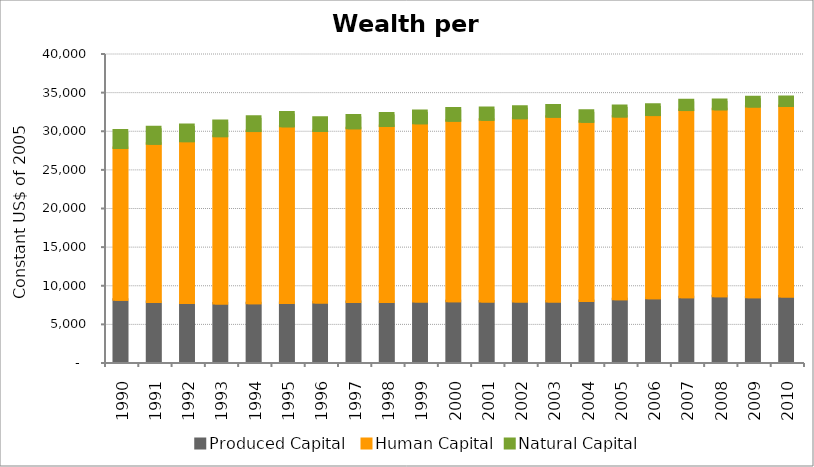
| Category | Produced Capital  | Human Capital | Natural Capital |
|---|---|---|---|
| 1990.0 | 8049.137 | 19653.275 | 2276.206 |
| 1991.0 | 7763.539 | 20486.15 | 2137.865 |
| 1992.0 | 7622.068 | 20968.73 | 2074.773 |
| 1993.0 | 7588.926 | 21650.348 | 1944.096 |
| 1994.0 | 7596.095 | 22299.273 | 1838.948 |
| 1995.0 | 7622.296 | 22881.421 | 1782.966 |
| 1996.0 | 7691.73 | 22221.202 | 1698.156 |
| 1997.0 | 7751.577 | 22501.893 | 1660.657 |
| 1998.0 | 7759.342 | 22794.087 | 1630.006 |
| 1999.0 | 7835.619 | 23064.88 | 1600.517 |
| 2000.0 | 7855.119 | 23387.187 | 1570.577 |
| 2001.0 | 7839.721 | 23517.653 | 1518.81 |
| 2002.0 | 7822.029 | 23741.343 | 1486.495 |
| 2003.0 | 7820.341 | 23942.82 | 1443.489 |
| 2004.0 | 7906.656 | 23190.856 | 1418.567 |
| 2005.0 | 8125.127 | 23660.782 | 1368.881 |
| 2006.0 | 8258.48 | 23701.857 | 1327.174 |
| 2007.0 | 8375.765 | 24236.101 | 1262.623 |
| 2008.0 | 8513.991 | 24188.395 | 1222.019 |
| 2009.0 | 8391.334 | 24675.421 | 1199.809 |
| 2010.0 | 8477.341 | 24675.836 | 1156.486 |